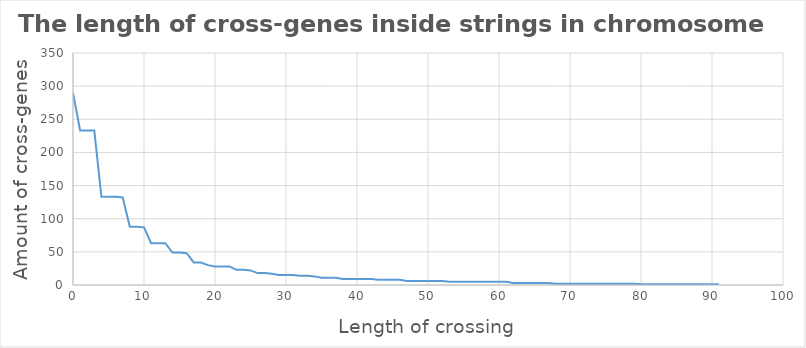
| Category | Cross (chr) |
|---|---|
| 0.0 | 290 |
| 1.0 | 233 |
| 2.0 | 233 |
| 3.0 | 233 |
| 4.0 | 133 |
| 5.0 | 133 |
| 6.0 | 133 |
| 7.0 | 132 |
| 8.0 | 88 |
| 9.0 | 88 |
| 10.0 | 87 |
| 11.0 | 63 |
| 12.0 | 63 |
| 13.0 | 63 |
| 14.0 | 49 |
| 15.0 | 49 |
| 16.0 | 48 |
| 17.0 | 34 |
| 18.0 | 34 |
| 19.0 | 30 |
| 20.0 | 28 |
| 21.0 | 28 |
| 22.0 | 28 |
| 23.0 | 23 |
| 24.0 | 23 |
| 25.0 | 22 |
| 26.0 | 18 |
| 27.0 | 18 |
| 28.0 | 17 |
| 29.0 | 15 |
| 30.0 | 15 |
| 31.0 | 15 |
| 32.0 | 14 |
| 33.0 | 14 |
| 34.0 | 13 |
| 35.0 | 11 |
| 36.0 | 11 |
| 37.0 | 11 |
| 38.0 | 9 |
| 39.0 | 9 |
| 40.0 | 9 |
| 41.0 | 9 |
| 42.0 | 9 |
| 43.0 | 8 |
| 44.0 | 8 |
| 45.0 | 8 |
| 46.0 | 8 |
| 47.0 | 6 |
| 48.0 | 6 |
| 49.0 | 6 |
| 50.0 | 6 |
| 51.0 | 6 |
| 52.0 | 6 |
| 53.0 | 5 |
| 54.0 | 5 |
| 55.0 | 5 |
| 56.0 | 5 |
| 57.0 | 5 |
| 58.0 | 5 |
| 59.0 | 5 |
| 60.0 | 5 |
| 61.0 | 5 |
| 62.0 | 3 |
| 63.0 | 3 |
| 64.0 | 3 |
| 65.0 | 3 |
| 66.0 | 3 |
| 67.0 | 3 |
| 68.0 | 2 |
| 69.0 | 2 |
| 70.0 | 2 |
| 71.0 | 2 |
| 72.0 | 2 |
| 73.0 | 2 |
| 74.0 | 2 |
| 75.0 | 2 |
| 76.0 | 2 |
| 77.0 | 2 |
| 78.0 | 2 |
| 79.0 | 2 |
| 80.0 | 1 |
| 81.0 | 1 |
| 82.0 | 1 |
| 83.0 | 1 |
| 84.0 | 1 |
| 85.0 | 1 |
| 86.0 | 1 |
| 87.0 | 1 |
| 88.0 | 1 |
| 89.0 | 1 |
| 90.0 | 1 |
| 91.0 | 1 |